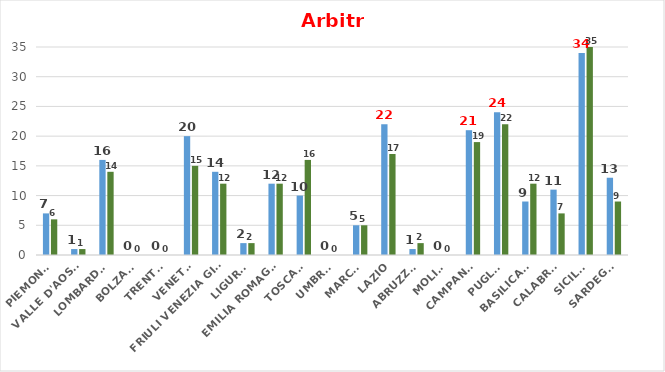
| Category | Series 0 | Series 1 |
|---|---|---|
| PIEMONTE | 7 | 6 |
| VALLE D'AOSTA | 1 | 1 |
| LOMBARDIA | 16 | 14 |
| BOLZANO | 0 | 0 |
| TRENTO | 0 | 0 |
| VENETO | 20 | 15 |
| FRIULI VENEZIA GIULIA | 14 | 12 |
| LIGURIA | 2 | 2 |
| EMILIA ROMAGNA | 12 | 12 |
| TOSCANA | 10 | 16 |
| UMBRIA | 0 | 0 |
| MARCHE | 5 | 5 |
| LAZIO | 22 | 17 |
| ABRUZZO | 1 | 2 |
| MOLISE | 0 | 0 |
| CAMPANIA | 21 | 19 |
| PUGLIA | 24 | 22 |
| BASILICATA | 9 | 12 |
| CALABRIA | 11 | 7 |
| SICILIA | 34 | 35 |
| SARDEGNA | 13 | 9 |